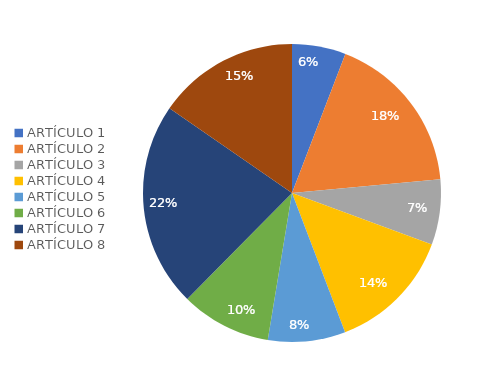
| Category | Series 0 | Series 1 |
|---|---|---|
| ARTÍCULO 1 | 0.058 | 0.058 |
| ARTÍCULO 2 | 0.177 | 0.177 |
| ARTÍCULO 3 | 0.071 | 0.071 |
| ARTÍCULO 4 | 0.136 | 0.136 |
| ARTÍCULO 5 | 0.084 | 0.084 |
| ARTÍCULO 6 | 0.098 | 0.098 |
| ARTÍCULO 7 | 0.222 | 0.222 |
| ARTÍCULO 8 | 0.154 | 0.154 |